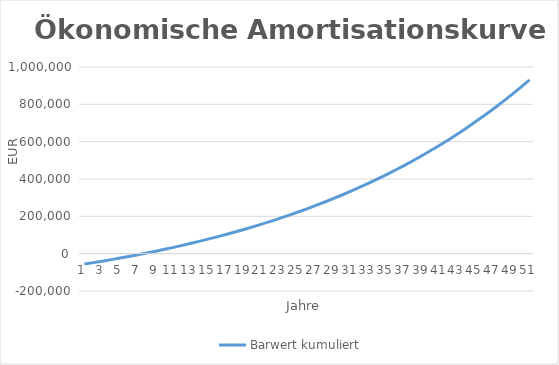
| Category | Barwert kumuliert |
|---|---|
| 0 | -55706 |
| 1 | -48052.226 |
| 2 | -40134.529 |
| 3 | -31943.807 |
| 4 | -23470.648 |
| 5 | -14705.31 |
| 6 | -5637.719 |
| 7 | 3742.548 |
| 8 | 13446.272 |
| 9 | 23484.607 |
| 10 | 33869.091 |
| 11 | 44611.662 |
| 12 | 55724.665 |
| 13 | 67220.876 |
| 14 | 79113.508 |
| 15 | 91416.23 |
| 16 | 104143.185 |
| 17 | 117309 |
| 18 | 130928.808 |
| 19 | 145018.265 |
| 20 | 159593.565 |
| 21 | 174671.462 |
| 22 | 190269.287 |
| 23 | 206404.967 |
| 24 | 223097.05 |
| 25 | 240364.723 |
| 26 | 258227.832 |
| 27 | 276706.911 |
| 28 | 295823.199 |
| 29 | 315598.669 |
| 30 | 336056.053 |
| 31 | 357218.863 |
| 32 | 379111.425 |
| 33 | 401758.904 |
| 34 | 425187.329 |
| 35 | 449423.632 |
| 36 | 474495.669 |
| 37 | 500432.259 |
| 38 | 527263.215 |
| 39 | 555019.375 |
| 40 | 583732.645 |
| 41 | 613436.028 |
| 42 | 644163.665 |
| 43 | 675950.875 |
| 44 | 708834.197 |
| 45 | 742851.426 |
| 46 | 778041.663 |
| 47 | 814445.356 |
| 48 | 852104.349 |
| 49 | 891061.928 |
| 50 | 931362.872 |